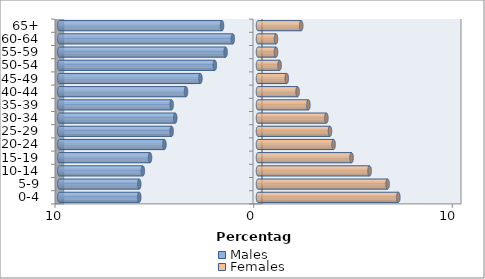
| Category | Males | Females |
|---|---|---|
| 0-4 | -5.978 | 7.065 |
| 5-9 | -5.978 | 6.522 |
| 10-14 | -5.797 | 5.616 |
| 15-19 | -5.435 | 4.71 |
| 20-24 | -4.71 | 3.804 |
| 25-29 | -4.348 | 3.623 |
| 30-34 | -4.167 | 3.442 |
| 35-39 | -4.348 | 2.536 |
| 40-44 | -3.623 | 1.993 |
| 45-49 | -2.899 | 1.449 |
| 50-54 | -2.174 | 1.087 |
| 55-59 | -1.63 | 0.906 |
| 60-64 | -1.268 | 0.906 |
| 65+ | -1.812 | 2.174 |